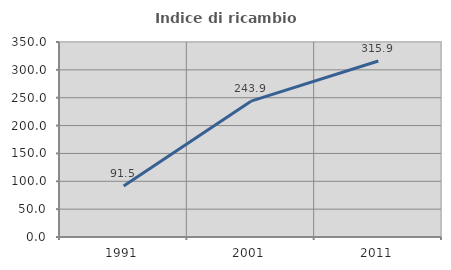
| Category | Indice di ricambio occupazionale  |
|---|---|
| 1991.0 | 91.463 |
| 2001.0 | 243.86 |
| 2011.0 | 315.942 |